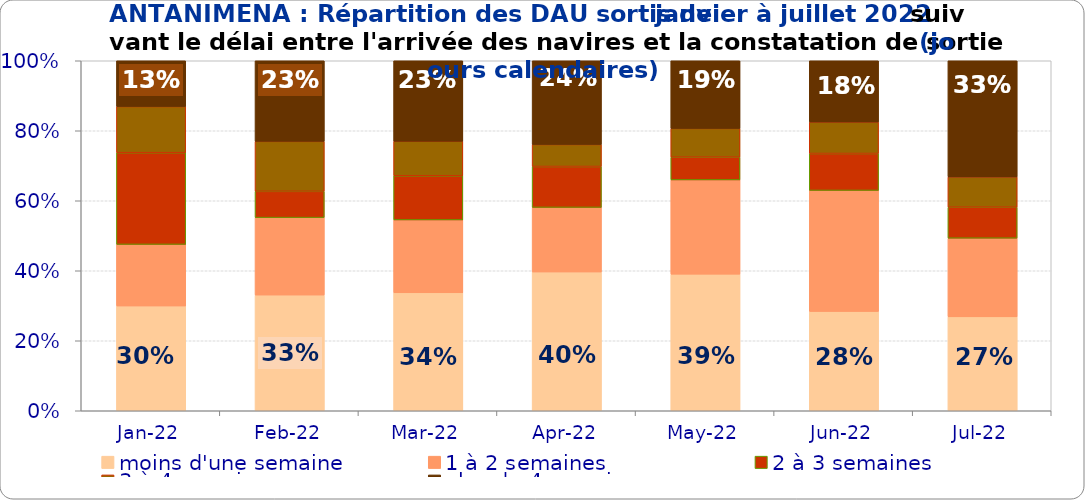
| Category | moins d'une semaine | 1 à 2 semaines | 2 à 3 semaines | 3 à 4 semaines | plus de 4 semaines |
|---|---|---|---|---|---|
| 2022-01-01 | 0.299 | 0.176 | 0.262 | 0.132 | 0.131 |
| 2022-02-01 | 0.331 | 0.221 | 0.075 | 0.143 | 0.23 |
| 2022-03-01 | 0.337 | 0.208 | 0.126 | 0.099 | 0.23 |
| 2022-04-01 | 0.396 | 0.185 | 0.117 | 0.063 | 0.239 |
| 2022-05-01 | 0.39 | 0.269 | 0.065 | 0.082 | 0.193 |
| 2022-06-01 | 0.284 | 0.346 | 0.106 | 0.09 | 0.175 |
| 2022-07-01 | 0.268 | 0.225 | 0.088 | 0.087 | 0.332 |